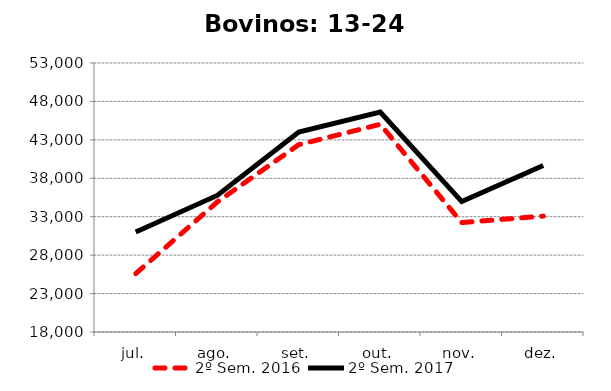
| Category | 2º Sem. 2016 | 2º Sem. 2017 |
|---|---|---|
| jul. | 25596 | 31020 |
| ago. | 34915 | 35769 |
| set. | 42372 | 44004 |
| out. | 45022 | 46612 |
| nov. | 32237 | 34966 |
| dez. | 33079 | 39655 |